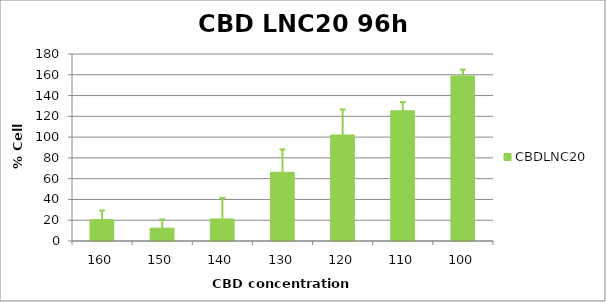
| Category | CBDLNC20 |
|---|---|
| 160.0 | 20.418 |
| 150.0 | 12.381 |
| 140.0 | 21.211 |
| 130.0 | 66.084 |
| 120.0 | 101.983 |
| 110.0 | 125.328 |
| 100.0 | 158.877 |